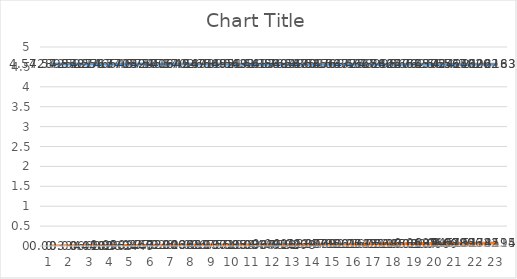
| Category | Series 0 | Series 1 |
|---|---|---|
| 0 | 4.573 | 0 |
| 1 | 4.573 | 0.003 |
| 2 | 4.572 | 0.007 |
| 3 | 4.572 | 0.01 |
| 4 | 4.571 | 0.013 |
| 5 | 4.571 | 0.017 |
| 6 | 4.571 | 0.02 |
| 7 | 4.57 | 0.023 |
| 8 | 4.57 | 0.027 |
| 9 | 4.57 | 0.03 |
| 10 | 4.569 | 0.033 |
| 11 | 4.569 | 0.037 |
| 12 | 4.568 | 0.04 |
| 13 | 4.568 | 0.043 |
| 14 | 4.568 | 0.047 |
| 15 | 4.567 | 0.05 |
| 16 | 4.567 | 0.054 |
| 17 | 4.567 | 0.057 |
| 18 | 4.566 | 0.06 |
| 19 | 4.566 | 0.064 |
| 20 | 4.565 | 0.067 |
| 21 | 4.565 | 0.07 |
| 22 | 4.565 | 0.074 |